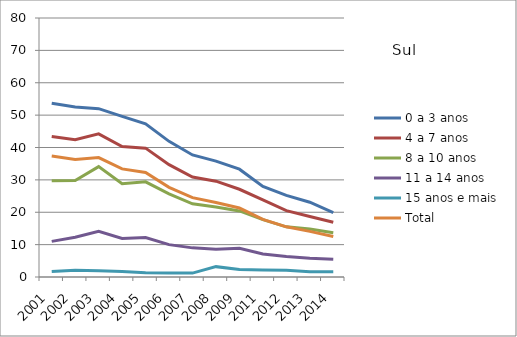
| Category | 0 a 3 anos | 4 a 7 anos | 8 a 10 anos | 11 a 14 anos | 15 anos e mais | Total |
|---|---|---|---|---|---|---|
| 2001.0 | 53.7 | 43.4 | 29.7 | 11 | 1.7 | 37.4 |
| 2002.0 | 52.5 | 42.4 | 29.8 | 12.3 | 2.1 | 36.3 |
| 2003.0 | 52 | 44.2 | 34.1 | 14.1 | 1.9 | 36.9 |
| 2004.0 | 49.6 | 40.3 | 28.8 | 11.9 | 1.7 | 33.4 |
| 2005.0 | 47.3 | 39.8 | 29.4 | 12.2 | 1.3 | 32.3 |
| 2006.0 | 41.9 | 34.7 | 25.7 | 10 | 1.2 | 27.7 |
| 2007.0 | 37.7 | 30.9 | 22.6 | 9 | 1.2 | 24.5 |
| 2008.0 | 35.8 | 29.6 | 21.6 | 8.6 | 3.2 | 23 |
| 2009.0 | 33.3 | 27.1 | 20.4 | 8.9 | 2.3 | 21.3 |
| 2011.0 | 28 | 23.8 | 17.7 | 7.1 | 2.2 | 17.8 |
| 2012.0 | 25.2 | 20.5 | 15.5 | 6.3 | 2.1 | 15.5 |
| 2013.0 | 23.1 | 18.7 | 14.8 | 5.8 | 1.6 | 14.1 |
| 2014.0 | 19.9 | 16.9 | 13.7 | 5.5 | 1.6 | 12.5 |